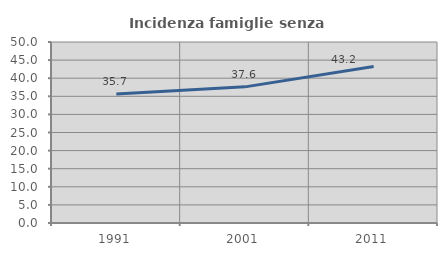
| Category | Incidenza famiglie senza nuclei |
|---|---|
| 1991.0 | 35.661 |
| 2001.0 | 37.606 |
| 2011.0 | 43.223 |